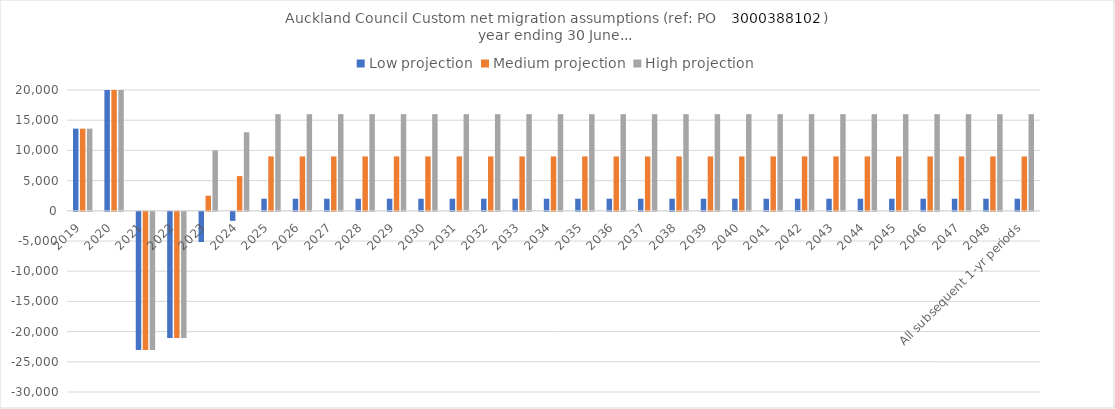
| Category | Low projection | Medium projection | High projection |
|---|---|---|---|
| 2019 | 13600 | 13600 | 13600 |
| 2020 | 20000 | 20000 | 20000 |
| 2021 | -22900 | -22900 | -22900 |
| 2022 | -20900 | -20900 | -20900 |
| 2023 | -5000 | 2500 | 10000 |
| 2024 | -1500 | 5750 | 13000 |
| 2025 | 2000 | 9000 | 16000 |
| 2026 | 2000 | 9000 | 16000 |
| 2027 | 2000 | 9000 | 16000 |
| 2028 | 2000 | 9000 | 16000 |
| 2029 | 2000 | 9000 | 16000 |
| 2030 | 2000 | 9000 | 16000 |
| 2031 | 2000 | 9000 | 16000 |
| 2032 | 2000 | 9000 | 16000 |
| 2033 | 2000 | 9000 | 16000 |
| 2034 | 2000 | 9000 | 16000 |
| 2035 | 2000 | 9000 | 16000 |
| 2036 | 2000 | 9000 | 16000 |
| 2037 | 2000 | 9000 | 16000 |
| 2038 | 2000 | 9000 | 16000 |
| 2039 | 2000 | 9000 | 16000 |
| 2040 | 2000 | 9000 | 16000 |
| 2041 | 2000 | 9000 | 16000 |
| 2042 | 2000 | 9000 | 16000 |
| 2043 | 2000 | 9000 | 16000 |
| 2044 | 2000 | 9000 | 16000 |
| 2045 | 2000 | 9000 | 16000 |
| 2046 | 2000 | 9000 | 16000 |
| 2047 | 2000 | 9000 | 16000 |
| 2048 | 2000 | 9000 | 16000 |
| All subsequent 1-yr periods | 2000 | 9000 | 16000 |